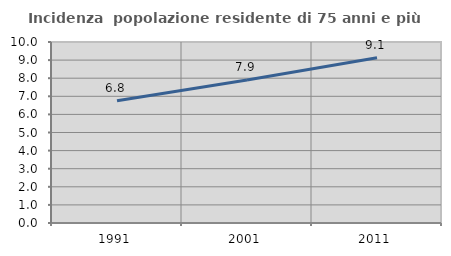
| Category | Incidenza  popolazione residente di 75 anni e più |
|---|---|
| 1991.0 | 6.758 |
| 2001.0 | 7.904 |
| 2011.0 | 9.135 |